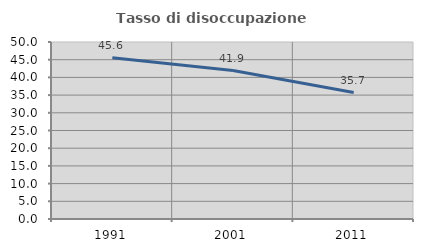
| Category | Tasso di disoccupazione giovanile  |
|---|---|
| 1991.0 | 45.57 |
| 2001.0 | 41.935 |
| 2011.0 | 35.714 |